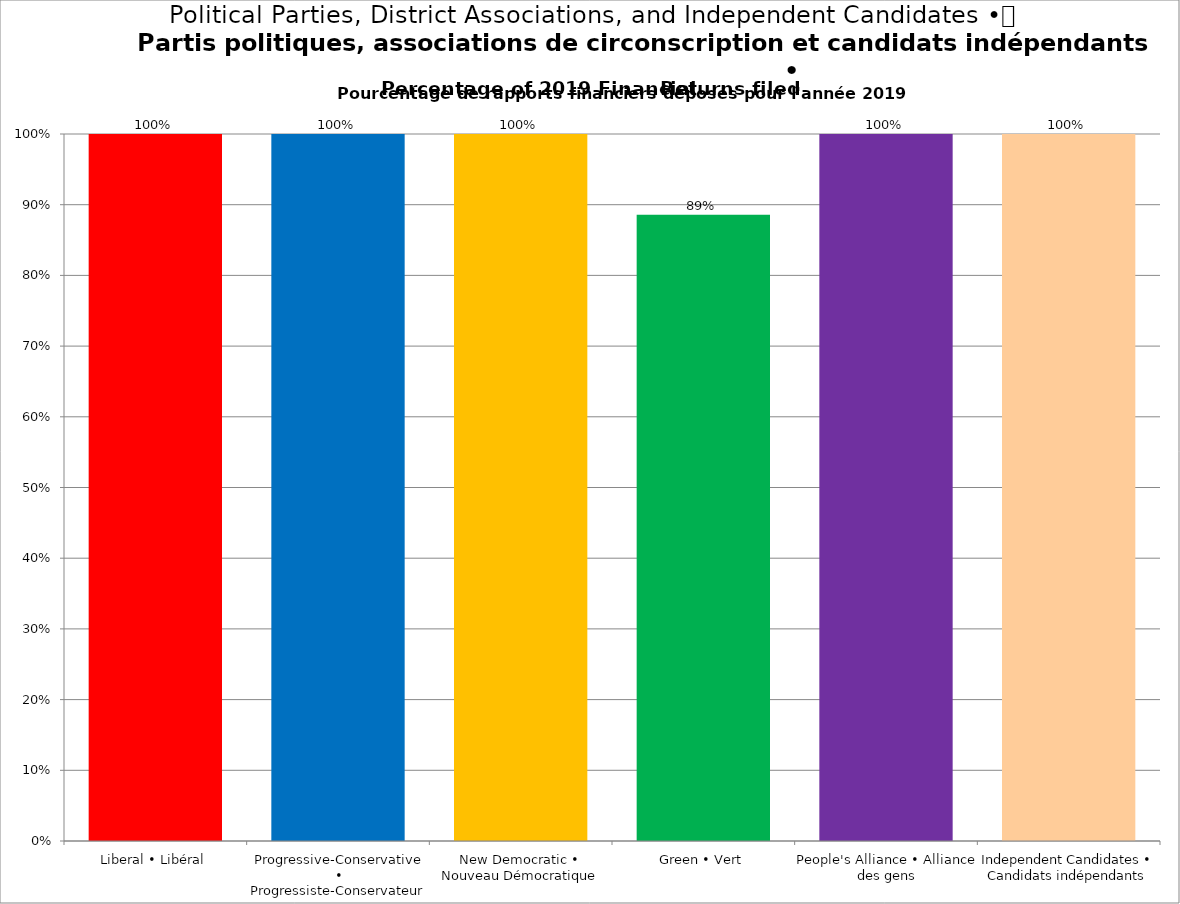
| Category | Series 0 | Series 2 | Series 4 |
|---|---|---|---|
| Liberal • Libéral | 1 |  |  |
| Progressive-Conservative • Progressiste-Conservateur | 1 |  |  |
| New Democratic • Nouveau Démocratique | 1 |  |  |
| Green • Vert | 0.886 |  |  |
| People's Alliance • Alliance des gens | 1 |  |  |
| Independent Candidates • Candidats indépendants | 1 |  |  |